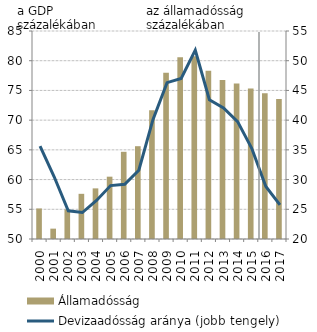
| Category | Államadósság |
|---|---|
| 2000.0 | 55.142 |
| 2001.0 | 51.743 |
| 2002.0 | 54.994 |
| 2003.0 | 57.602 |
| 2004.0 | 58.519 |
| 2005.0 | 60.486 |
| 2006.0 | 64.674 |
| 2007.0 | 65.616 |
| 2008.0 | 71.647 |
| 2009.0 | 77.958 |
| 2010.0 | 80.582 |
| 2011.0 | 80.76 |
| 2012.0 | 78.294 |
| 2013.0 | 76.755 |
| 2014.0 | 76.179 |
| 2015.0 | 75.326 |
| 2016.0 | 74.534 |
| 2017.0 | 73.539 |